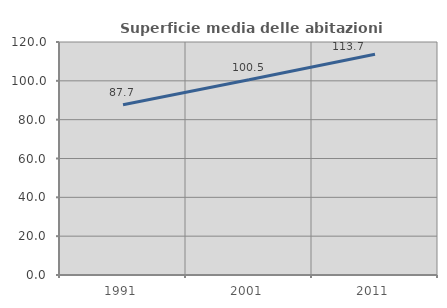
| Category | Superficie media delle abitazioni occupate |
|---|---|
| 1991.0 | 87.656 |
| 2001.0 | 100.52 |
| 2011.0 | 113.721 |